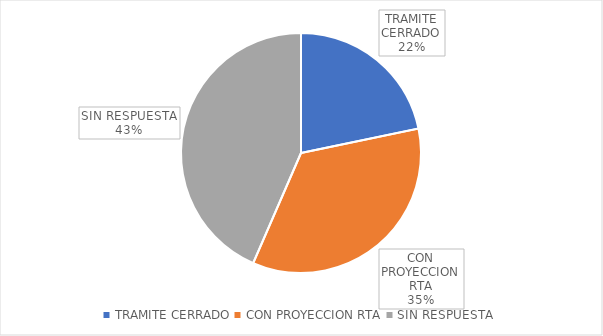
| Category | Series 0 |
|---|---|
| TRAMITE CERRADO | 5 |
| CON PROYECCION RTA | 8 |
| SIN RESPUESTA | 10 |